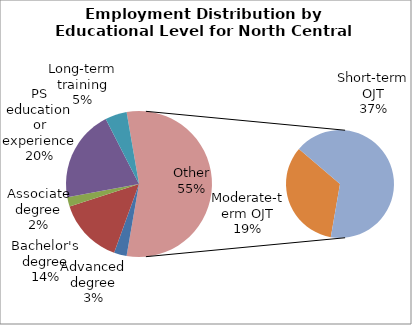
| Category | Series 0 |
|---|---|
| Advanced degree | 2570 |
| Bachelor's degree | 13220 |
| Associate degree | 1900 |
| PS education or experience | 18650 |
| Long-term training | 4400 |
| Moderate-term OJT | 17010 |
| Short-term OJT | 33710 |